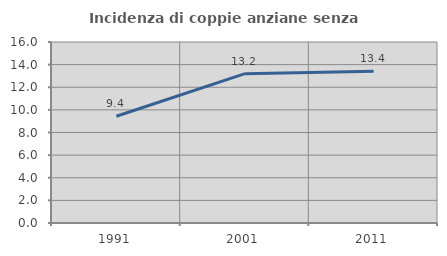
| Category | Incidenza di coppie anziane senza figli  |
|---|---|
| 1991.0 | 9.436 |
| 2001.0 | 13.203 |
| 2011.0 | 13.418 |